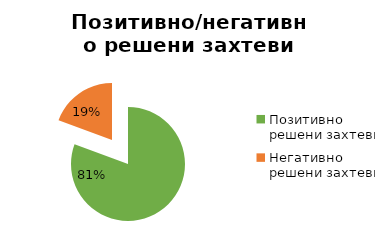
| Category | Series 0 |
|---|---|
| Позитивно решени захтеви | 24888 |
| Негативно решени захтеви | 5976 |